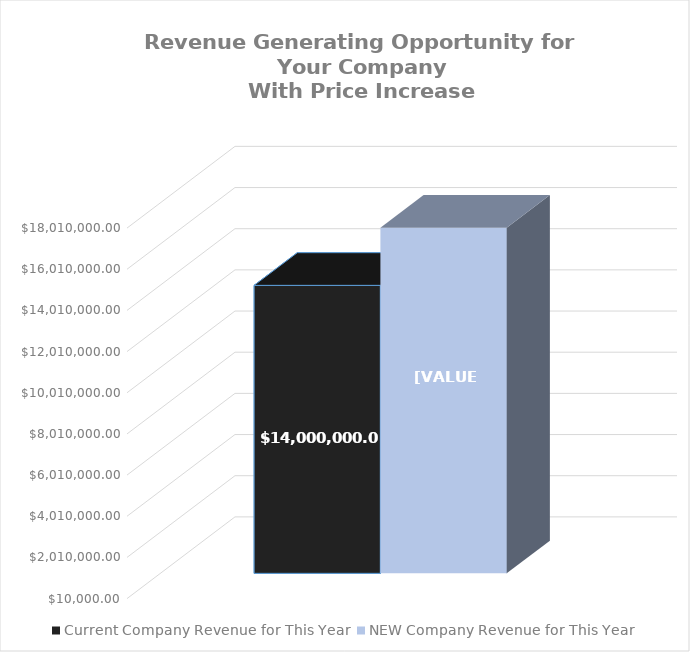
| Category | Current Company Revenue for This Year | NEW Company Revenue for This Year |
|---|---|---|
| 0 | 14000000 | 16800000 |